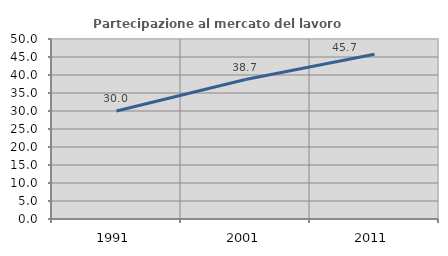
| Category | Partecipazione al mercato del lavoro  femminile |
|---|---|
| 1991.0 | 30 |
| 2001.0 | 38.747 |
| 2011.0 | 45.738 |